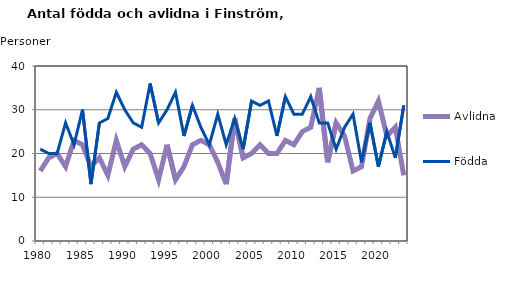
| Category | Avlidna | Födda |
|---|---|---|
| 1980.0 | 16 | 21 |
| 1981.0 | 19 | 20 |
| 1982.0 | 20 | 20 |
| 1983.0 | 17 | 27 |
| 1984.0 | 23 | 22 |
| 1985.0 | 22 | 30 |
| 1986.0 | 17 | 13 |
| 1987.0 | 19 | 27 |
| 1988.0 | 15 | 28 |
| 1989.0 | 23 | 34 |
| 1990.0 | 17 | 30 |
| 1991.0 | 21 | 27 |
| 1992.0 | 22 | 26 |
| 1993.0 | 20 | 36 |
| 1994.0 | 14 | 27 |
| 1995.0 | 22 | 30 |
| 1996.0 | 14 | 34 |
| 1997.0 | 17 | 24 |
| 1998.0 | 22 | 31 |
| 1999.0 | 23 | 26 |
| 2000.0 | 22 | 22 |
| 2001.0 | 18 | 29 |
| 2002.0 | 13 | 22 |
| 2003.0 | 28 | 28 |
| 2004.0 | 19 | 21 |
| 2005.0 | 20 | 32 |
| 2006.0 | 22 | 31 |
| 2007.0 | 20 | 32 |
| 2008.0 | 20 | 24 |
| 2009.0 | 23 | 33 |
| 2010.0 | 22 | 29 |
| 2011.0 | 25 | 29 |
| 2012.0 | 26 | 33 |
| 2013.0 | 35 | 27 |
| 2014.0 | 18 | 27 |
| 2015.0 | 27 | 21 |
| 2016.0 | 24 | 26 |
| 2017.0 | 16 | 29 |
| 2018.0 | 17 | 18 |
| 2019.0 | 28 | 27 |
| 2020.0 | 32 | 17 |
| 2021.0 | 24 | 25 |
| 2022.0 | 26 | 19 |
| 2023.0 | 15 | 31 |